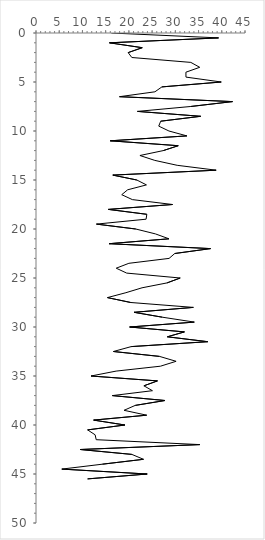
| Category | Series 0 |
|---|---|
| 16.222222222222225 | 0 |
| 39.309868875086266 | 0.5 |
| 15.811965811965813 | 1 |
| 22.873900293255133 | 1.5 |
| 19.84126984126984 | 2 |
| 20.634920634920636 | 2.5 |
| 33.333333333333336 | 3 |
| 35.25197328476017 | 3.5 |
| 32.27891156462585 | 4 |
| 32.28758169934641 | 4.5 |
| 39.88603988603989 | 5 |
| 27.111111111111114 | 5.5 |
| 25.607287449392715 | 6 |
| 17.97979797979798 | 6.5 |
| 42.305764411027575 | 7 |
| 33.281653746770026 | 7.5 |
| 21.843434343434343 | 8 |
| 35.44973544973545 | 8.5 |
| 26.85185185185185 | 9 |
| 26.42736376641956 | 9.5 |
| 28.627450980392155 | 10 |
| 32.488344988344984 | 10.5 |
| 15.978593272171253 | 11 |
| 30.62678062678063 | 11.5 |
| 27.3989898989899 | 12 |
| 22.377622377622377 | 12.5 |
| 25.582750582750588 | 13 |
| 30.395913154533844 | 13.5 |
| 38.78787878787879 | 14 |
| 16.541353383458645 | 14.5 |
| 21.70925869587263 | 15 |
| 23.780068728522338 | 15.5 |
| 19.727891156462587 | 16 |
| 18.46240179573513 | 16.5 |
| 20.74074074074074 | 17 |
| 29.4017094017094 | 17.5 |
| 15.584415584415586 | 18 |
| 23.863636363636363 | 18.5 |
| 23.703703703703706 | 19 |
| 13.015873015873018 | 19.5 |
| 21.48148148148148 | 20 |
| 25.71428571428571 | 20.5 |
| 28.626470894512135 | 21 |
| 15.74074074074074 | 21.5 |
| 37.57575757575758 | 22 |
| 29.87468671679198 | 22.5 |
| 28.65424430641822 | 23 |
| 20.0 | 23.5 |
| 17.273954116059382 | 24 |
| 19.52861952861953 | 24.5 |
| 31.049846839320526 | 25 |
| 28.216619981325863 | 25.5 |
| 22.82950967161494 | 26 |
| 19.363878380271824 | 26.5 |
| 15.384615384615385 | 27 |
| 20.40897698792436 | 27.5 |
| 33.878406708595385 | 28 |
| 21.111111111111114 | 28.5 |
| 27.19421101774043 | 29 |
| 34.08637142542722 | 29.5 |
| 20.161258948023654 | 30 |
| 31.959913615296887 | 30.5 |
| 28.282828282828287 | 31 |
| 36.97598697598698 | 31.5 |
| 20.502645502645503 | 32 |
| 16.666666666666668 | 32.5 |
| 26.593733344553844 | 33 |
| 30.165692007797272 | 33.5 |
| 26.8013468013468 | 34 |
| 17.249417249417252 | 34.5 |
| 11.842105263157896 | 35 |
| 26.1474098683401 | 35.5 |
| 23.232323232323235 | 36 |
| 25.07122507122507 | 36.5 |
| 16.430976430976433 | 37 |
| 27.777777777777782 | 37.5 |
| 21.367521367521366 | 38 |
| 18.954248366013072 | 38.5 |
| 23.829961169016965 | 39 |
| 12.40981240981241 | 39.5 |
| 19.145299145299145 | 40 |
| 11.111111111111112 | 40.5 |
| 12.727272727272728 | 41 |
| 12.962962962962962 | 41.5 |
| 35.26936026936027 | 42 |
| 9.523809523809524 | 42.5 |
| 20.634920634920636 | 43 |
| 23.14814814814815 | 43.5 |
| 14.285714285714286 | 44 |
| 5.555555555555556 | 44.5 |
| 23.940620782726047 | 45 |
| 11.111111111111112 | 45.5 |